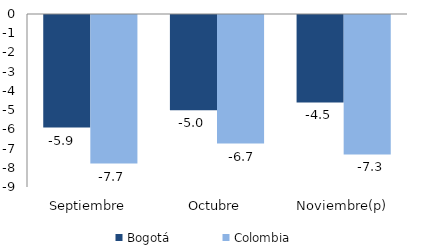
| Category | Bogotá | Colombia |
|---|---|---|
| Septiembre | -5.855 | -7.726 |
| Octubre | -4.961 | -6.688 |
| Noviembre(p) | -4.548 | -7.255 |